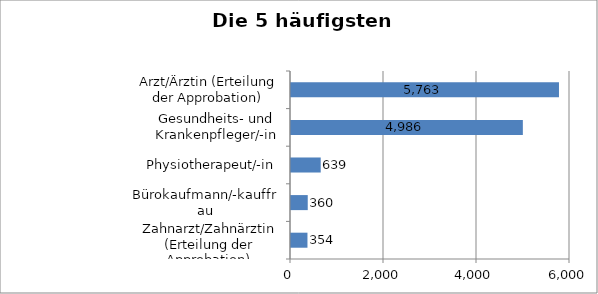
| Category | Series 0 |
|---|---|
| Zahnarzt/Zahnärztin (Erteilung der Approbation) | 354 |
| Bürokaufmann/-kauffrau | 360 |
| Physiotherapeut/-in | 639 |
| Gesundheits- und Krankenpfleger/-in | 4986 |
| Arzt/Ärztin (Erteilung der Approbation) | 5763 |